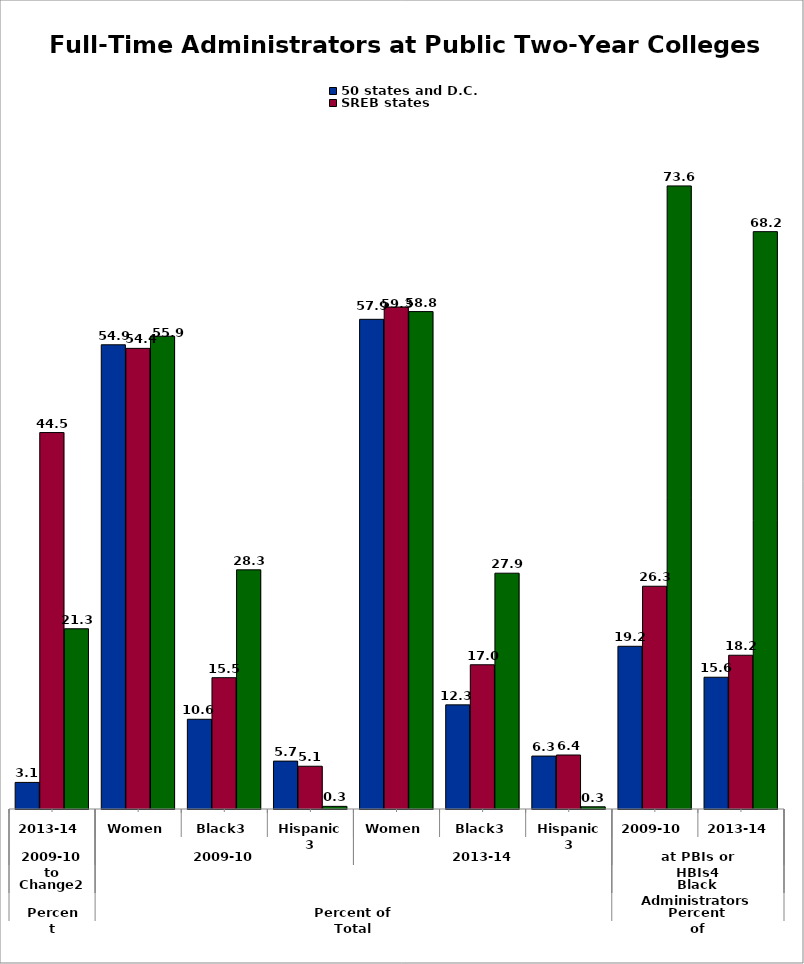
| Category | 50 states and D.C. | SREB states | State |
|---|---|---|---|
| 0 | 3.142 | 44.484 | 21.296 |
| 1 | 54.856 | 54.432 | 55.864 |
| 2 | 10.603 | 15.515 | 28.261 |
| 3 | 5.659 | 5.052 | 0.311 |
| 4 | 57.865 | 59.318 | 58.779 |
| 5 | 12.305 | 17.042 | 27.865 |
| 6 | 6.254 | 6.38 | 0.26 |
| 7 | 19.227 | 26.323 | 73.626 |
| 8 | 15.57 | 18.169 | 68.224 |